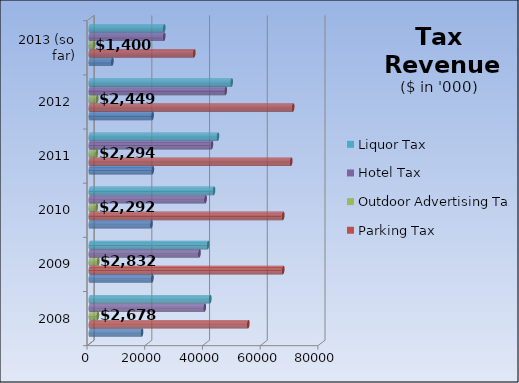
| Category | Amusement Tax | Parking Tax  | Outdoor Advertising Tax  | Hotel Tax  | Liquor Tax |
|---|---|---|---|---|---|
| _x0004_2008 | 17995 | 54819 | 2678 | 39737 | 41653 |
| _x0004_2009 | 21584 | 66925 | 2832 | 37912 | 40893 |
| _x0004_2010 | 21278 | 66925 | 2292 | 40018 | 42946 |
| _x0004_2011 | 21744 | 69690 | 2294 | 42208 | 44313 |
| _x0004_2012 | 21660 | 70366 | 2449 | 47012 | 49060 |
| _x000d_2013 (so far) | 7718 | 36094 | 1400 | 25674 | 25681 |